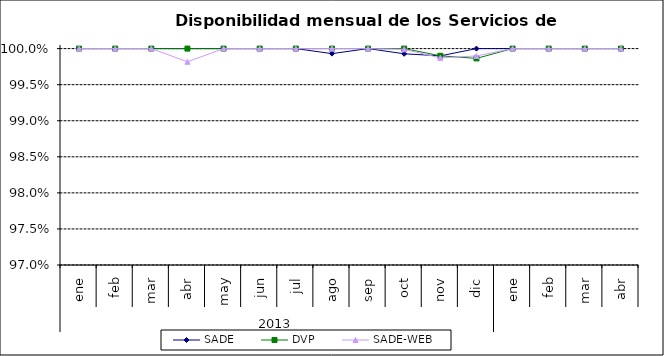
| Category | SADE | DVP | SADE-WEB |
|---|---|---|---|
| 0 | 1 | 1 | 1 |
| 1 | 1 | 1 | 1 |
| 2 | 1 | 1 | 1 |
| 3 | 1 | 1 | 0.998 |
| 4 | 1 | 1 | 1 |
| 5 | 1 | 1 | 1 |
| 6 | 1 | 1 | 1 |
| 7 | 0.999 | 1 | 1 |
| 8 | 1 | 1 | 1 |
| 9 | 0.999 | 1 | 1 |
| 10 | 0.999 | 0.999 | 0.999 |
| 11 | 1 | 0.999 | 0.999 |
| 12 | 1 | 1 | 1 |
| 13 | 1 | 1 | 1 |
| 14 | 1 | 1 | 1 |
| 15 | 1 | 1 | 1 |